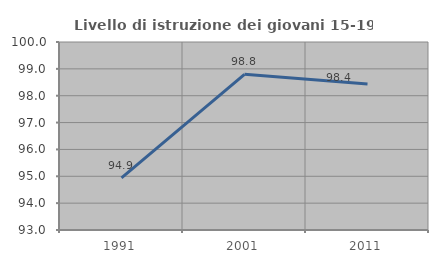
| Category | Livello di istruzione dei giovani 15-19 anni |
|---|---|
| 1991.0 | 94.938 |
| 2001.0 | 98.797 |
| 2011.0 | 98.435 |